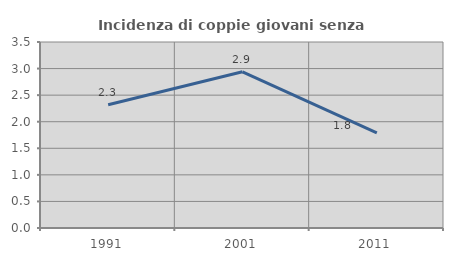
| Category | Incidenza di coppie giovani senza figli |
|---|---|
| 1991.0 | 2.319 |
| 2001.0 | 2.939 |
| 2011.0 | 1.788 |